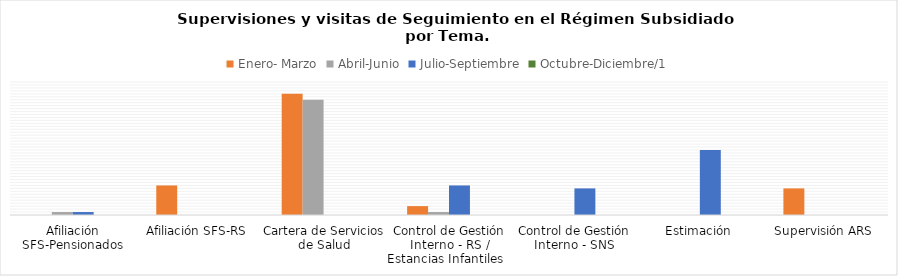
| Category | Enero- Marzo | Abril-Junio | Julio-Septiembre | Octubre-Diciembre/1 |
|---|---|---|---|---|
| Afiliación SFS-Pensionados | 0 | 1 | 1 | 0 |
| Afiliación SFS-RS | 10 | 0 | 0 | 0 |
| Cartera de Servicios de Salud | 41 | 39 | 0 | 0 |
| Control de Gestión Interno - RS / Estancias Infantiles   | 3 | 1 | 10 | 0 |
| Control de Gestión Interno - SNS | 0 | 0 | 9 | 0 |
| Estimación | 0 | 0 | 22 | 0 |
| Supervisión ARS | 9 | 0 | 0 | 0 |